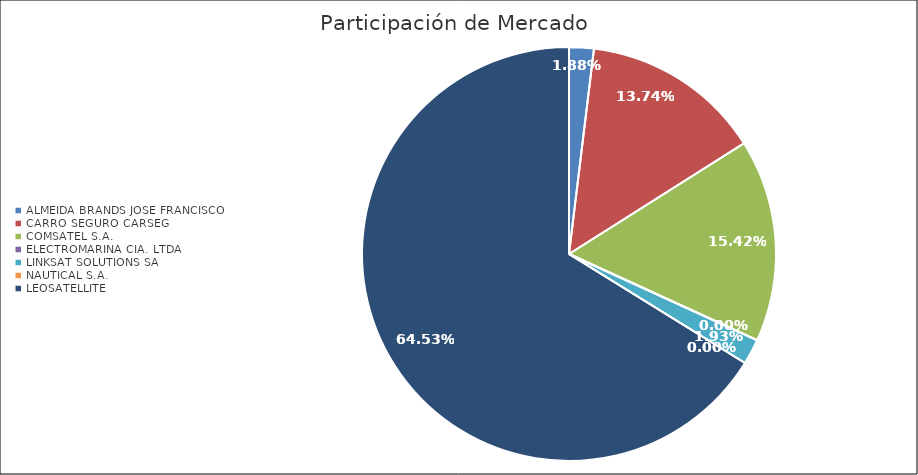
| Category | Series 0 |
|---|---|
| ALMEIDA BRANDS JOSE FRANCISCO | 0.019 |
| CARRO SEGURO CARSEG | 0.137 |
| COMSATEL S.A. | 0.154 |
| ELECTROMARINA CIA. LTDA | 0 |
| LINKSAT SOLUTIONS SA | 0.019 |
| NAUTICAL S.A. | 0 |
| LEOSATELLITE | 0.645 |